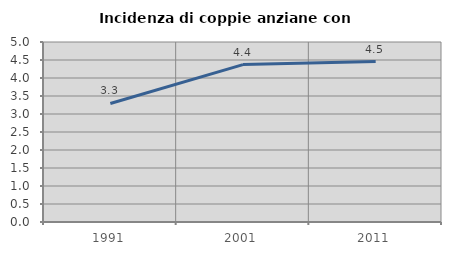
| Category | Incidenza di coppie anziane con figli |
|---|---|
| 1991.0 | 3.293 |
| 2001.0 | 4.372 |
| 2011.0 | 4.455 |